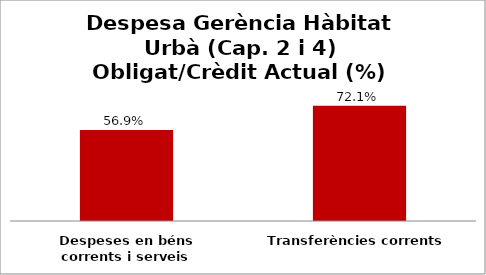
| Category | Series 0 |
|---|---|
| Despeses en béns corrents i serveis | 0.569 |
| Transferències corrents | 0.721 |